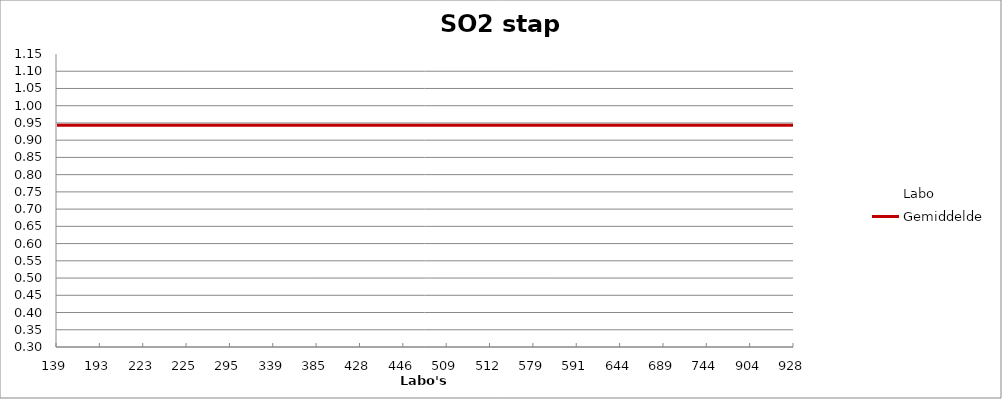
| Category | Labo | Gemiddelde |
|---|---|---|
| 139.0 | 1.095 | 0.943 |
| 193.0 | 0.99 | 0.943 |
| 223.0 | 1.049 | 0.943 |
| 225.0 | 0.953 | 0.943 |
| 295.0 | 0.931 | 0.943 |
| 339.0 | 0.844 | 0.943 |
| 385.0 | 1 | 0.943 |
| 428.0 | 0.819 | 0.943 |
| 446.0 | 0.97 | 0.943 |
| 509.0 | 0.983 | 0.943 |
| 512.0 | 0.325 | 0.943 |
| 579.0 | 0.984 | 0.943 |
| 591.0 | 1.003 | 0.943 |
| 644.0 | 0.904 | 0.943 |
| 689.0 | 0.965 | 0.943 |
| 744.0 | 0.787 | 0.943 |
| 904.0 | 0.916 | 0.943 |
| 928.0 | 0.971 | 0.943 |